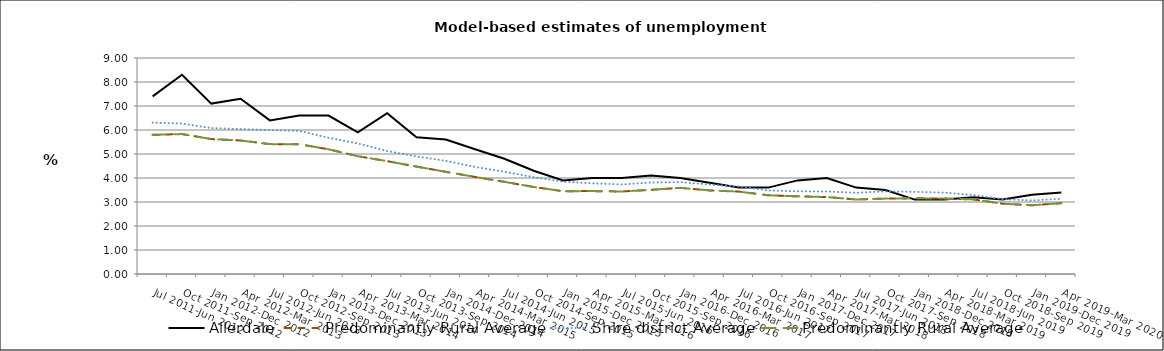
| Category | Allerdale | Predominantly Rural Average | Shire district Average |
|---|---|---|---|
| Jul 2011-Jun 2012 | 7.4 | 5.799 | 6.307 |
| Oct 2011-Sep 2012 | 8.3 | 5.83 | 6.271 |
| Jan 2012-Dec 2012 | 7.1 | 5.622 | 6.08 |
| Apr 2012-Mar 2013 | 7.3 | 5.563 | 6.038 |
| Jul 2012-Jun 2013 | 6.4 | 5.412 | 5.997 |
| Oct 2012-Sep 2013 | 6.6 | 5.408 | 5.965 |
| Jan 2013-Dec 2013 | 6.6 | 5.197 | 5.674 |
| Apr 2013-Mar 2014 | 5.9 | 4.908 | 5.439 |
| Jul 2013-Jun 2014 | 6.7 | 4.702 | 5.122 |
| Oct 2013-Sep 2014 | 5.7 | 4.477 | 4.902 |
| Jan 2014-Dec 2014 | 5.6 | 4.258 | 4.714 |
| Apr 2014-Mar 2015 | 5.2 | 4.044 | 4.461 |
| Jul 2014-Jun 2015 | 4.8 | 3.84 | 4.262 |
| Oct 2014-Sep 2015 | 4.3 | 3.626 | 4.035 |
| Jan 2015-Dec 2015 | 3.9 | 3.45 | 3.846 |
| Apr 2015-Mar 2016 | 4 | 3.455 | 3.778 |
| Jul 2015-Jun 2016 | 4 | 3.438 | 3.731 |
| Oct 2015-Sep 2016 | 4.1 | 3.507 | 3.813 |
| Jan 2016-Dec 2016 | 4 | 3.59 | 3.828 |
| Apr 2016-Mar 2017 | 3.8 | 3.483 | 3.728 |
| Jul 2016-Jun 2017 | 3.6 | 3.433 | 3.651 |
| Oct 2016-Sep 2017 | 3.6 | 3.28 | 3.479 |
| Jan 2017-Dec 2017 | 3.9 | 3.236 | 3.446 |
| Apr 2017-Mar 2018 | 4 | 3.206 | 3.437 |
| Jul 2017-Jun 2018 | 3.6 | 3.105 | 3.385 |
| Oct 2017-Sep 2018 | 3.5 | 3.142 | 3.444 |
| Jan 2018-Dec 2018 | 3.1 | 3.155 | 3.424 |
| Apr 2018-Mar 2019 | 3.1 | 3.144 | 3.392 |
| Jul 2018-Jun 2019 | 3.2 | 3.108 | 3.29 |
| Oct 2018-Sep 2019 | 3.1 | 2.928 | 3.116 |
| Jan 2019-Dec 2019 | 3.3 | 2.864 | 3.063 |
| Apr 2019-Mar 2020 | 3.4 | 2.951 | 3.136 |